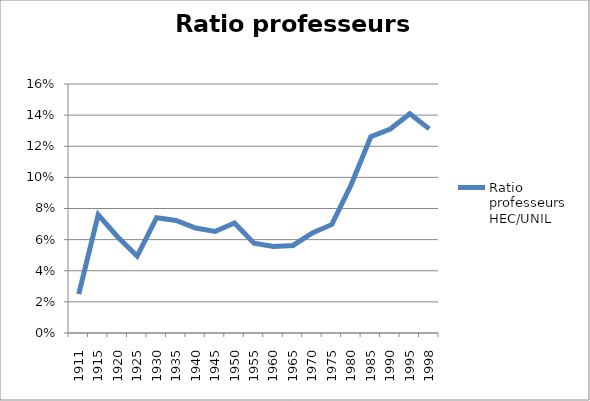
| Category | Ratio professeurs HEC/UNIL |
|---|---|
| 1911.0 | 0.025 |
| 1915.0 | 0.076 |
| 1920.0 | 0.062 |
| 1925.0 | 0.049 |
| 1930.0 | 0.074 |
| 1935.0 | 0.072 |
| 1940.0 | 0.067 |
| 1945.0 | 0.065 |
| 1950.0 | 0.071 |
| 1955.0 | 0.058 |
| 1960.0 | 0.056 |
| 1965.0 | 0.056 |
| 1970.0 | 0.064 |
| 1975.0 | 0.07 |
| 1980.0 | 0.096 |
| 1985.0 | 0.126 |
| 1990.0 | 0.131 |
| 1995.0 | 0.141 |
| 1998.0 | 0.131 |